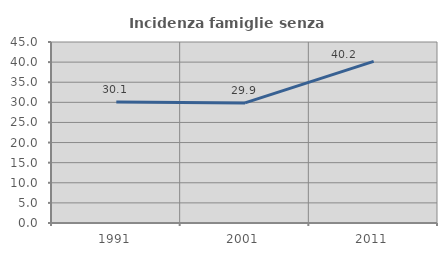
| Category | Incidenza famiglie senza nuclei |
|---|---|
| 1991.0 | 30.106 |
| 2001.0 | 29.852 |
| 2011.0 | 40.176 |